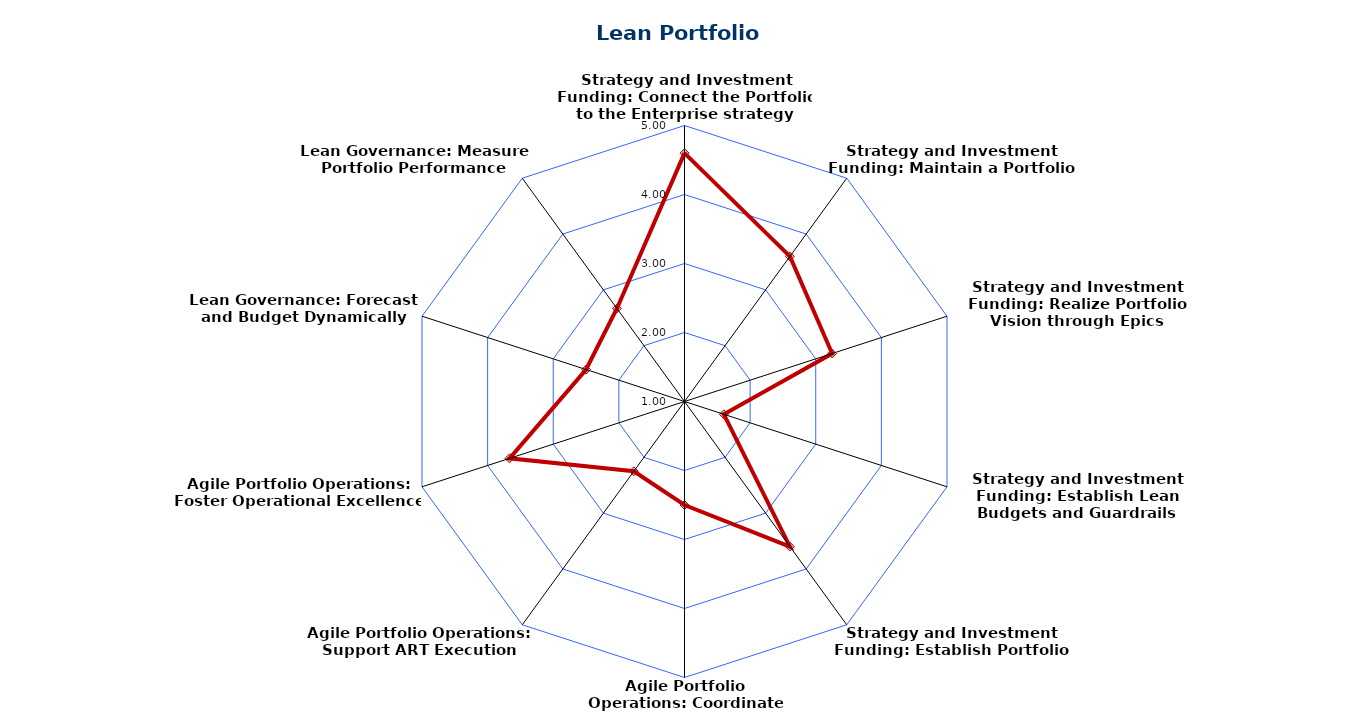
| Category | Series 0 |
|---|---|
| Strategy and Investment Funding: Connect the Portfolio to the Enterprise strategy | 4.6 |
| Strategy and Investment Funding: Maintain a Portfolio Vision | 3.6 |
| Strategy and Investment Funding: Realize Portfolio Vision through Epics | 3.25 |
| Strategy and Investment Funding: Establish Lean Budgets and Guardrails | 1.6 |
| Strategy and Investment Funding: Establish Portfolio Flow | 3.6 |
| Agile Portfolio Operations: Coordinate Value Streams | 2.5 |
| Agile Portfolio Operations: Support ART Execution | 2.25 |
| Agile Portfolio Operations: Foster Operational Excellence | 3.667 |
| Lean Governance: Forecast and Budget Dynamically | 2.5 |
| Lean Governance: Measure Portfolio Performance | 2.667 |